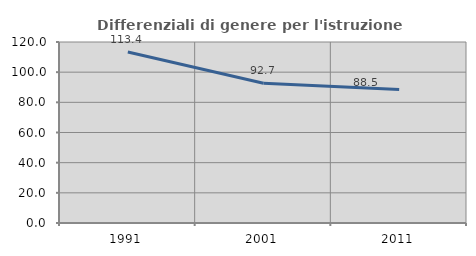
| Category | Differenziali di genere per l'istruzione superiore |
|---|---|
| 1991.0 | 113.388 |
| 2001.0 | 92.692 |
| 2011.0 | 88.46 |